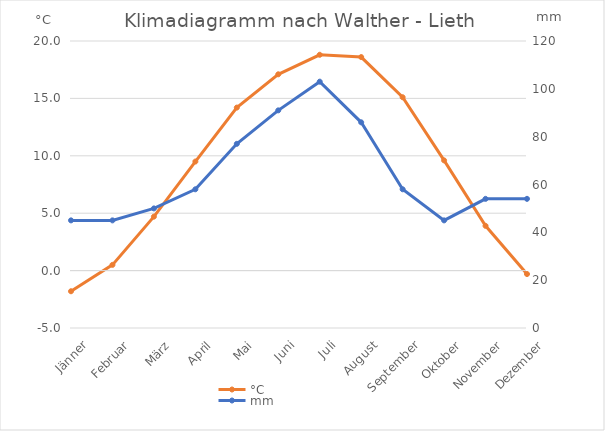
| Category | °C | Series 1 | Series 3 |
|---|---|---|---|
| Jänner | -1.8 |  |  |
| Februar | 0.5 |  |  |
| März | 4.7 |  |  |
| April | 9.5 |  |  |
| Mai | 14.2 |  |  |
| Juni | 17.1 |  |  |
| Juli | 18.8 |  |  |
| August | 18.6 |  |  |
| September | 15.1 |  |  |
| Oktober | 9.6 |  |  |
| November | 3.9 |  |  |
| Dezember | -0.3 |  |  |